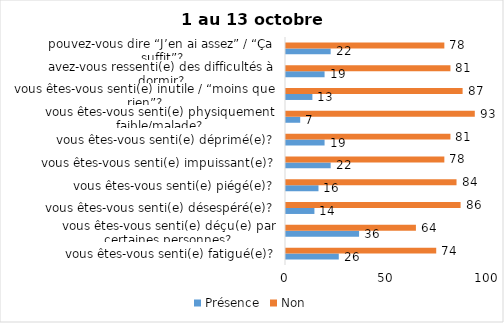
| Category | Présence | Non |
|---|---|---|
| vous êtes-vous senti(e) fatigué(e)? | 26 | 74 |
| vous êtes-vous senti(e) déçu(e) par certaines personnes? | 36 | 64 |
| vous êtes-vous senti(e) désespéré(e)? | 14 | 86 |
| vous êtes-vous senti(e) piégé(e)? | 16 | 84 |
| vous êtes-vous senti(e) impuissant(e)? | 22 | 78 |
| vous êtes-vous senti(e) déprimé(e)? | 19 | 81 |
| vous êtes-vous senti(e) physiquement faible/malade? | 7 | 93 |
| vous êtes-vous senti(e) inutile / “moins que rien”? | 13 | 87 |
| avez-vous ressenti(e) des difficultés à dormir? | 19 | 81 |
| pouvez-vous dire “J’en ai assez” / “Ça suffit”? | 22 | 78 |